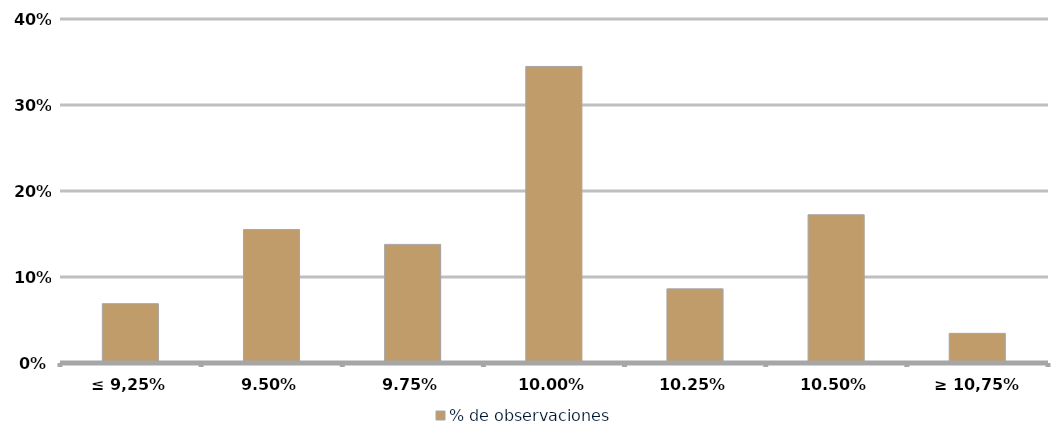
| Category | % de observaciones  |
|---|---|
| ≤ 9,25% | 0.069 |
| 9,50% | 0.155 |
| 9,75% | 0.138 |
| 10,00% | 0.345 |
| 10,25% | 0.086 |
| 10,50% | 0.172 |
| ≥ 10,75% | 0.034 |